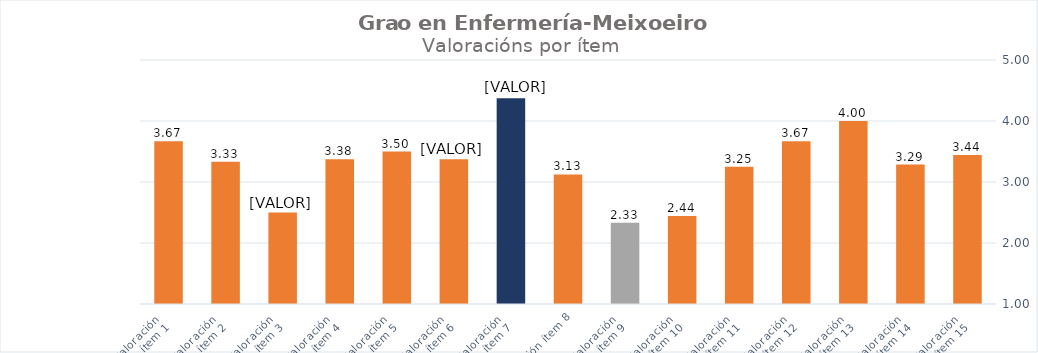
| Category | Series 0 |
|---|---|
| Valoración 
ítem 1 | 3.667 |
| Valoración 
ítem 2 | 3.333 |
| Valoración 
ítem 3 | 2.5 |
| Valoración 
ítem 4 | 3.375 |
| Valoración 
ítem 5 | 3.5 |
| Valoración 
ítem 6 | 3.375 |
| Valoración 
ítem 7 | 4.375 |
| Valoración ítem 8 | 3.125 |
| Valoración 
ítem 9 | 2.333 |
| Valoración 
ítem 10 | 2.444 |
| Valoración 
ítem 11 | 3.25 |
| Valoración 
ítem 12 | 3.667 |
| Valoración 
ítem 13 | 4 |
| Valoración 
ítem 14 | 3.286 |
| Valoración 
ítem 15 | 3.444 |